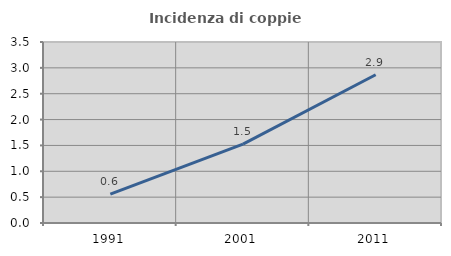
| Category | Incidenza di coppie miste |
|---|---|
| 1991.0 | 0.559 |
| 2001.0 | 1.524 |
| 2011.0 | 2.867 |